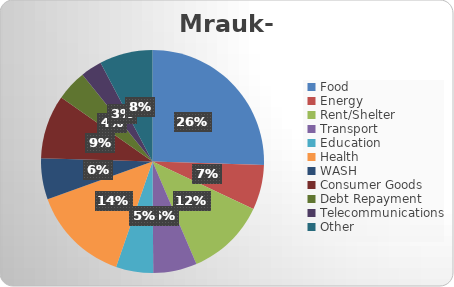
| Category | Series 0 |
|---|---|
| Food  | 123396.947 |
| Energy | 31347.328 |
| Rent/Shelter | 55893.13 |
| Transport | 30664.122 |
| Education | 26099.237 |
| Health | 68709.924 |
| WASH | 28778.626 |
| Consumer Goods | 44900.763 |
| Debt Repayment | 21526.718 |
| Telecommunications | 14984.733 |
| Other  | 37297.71 |